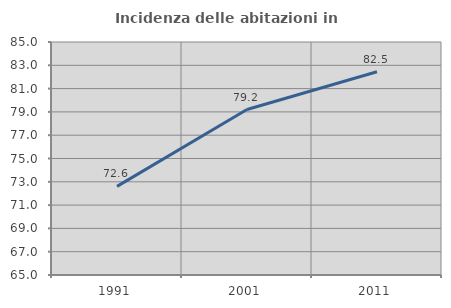
| Category | Incidenza delle abitazioni in proprietà  |
|---|---|
| 1991.0 | 72.611 |
| 2001.0 | 79.204 |
| 2011.0 | 82.45 |